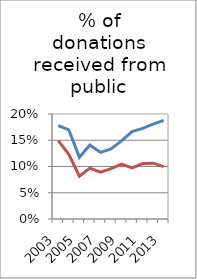
| Category | Fundraising  | Administration  |
|---|---|---|
| 2003 | 0.178 | 0.149 |
| 2004 | 0.17 | 0.123 |
| 2005 | 0.117 | 0.082 |
| 2006 | 0.141 | 0.097 |
| 2007 | 0.127 | 0.089 |
| 2008 | 0.134 | 0.096 |
| 2009 | 0.149 | 0.104 |
| 2010 | 0.167 | 0.097 |
| 2011 | 0.173 | 0.106 |
| 2012 | 0.181 | 0.106 |
| 2013 | 0.188 | 0.1 |